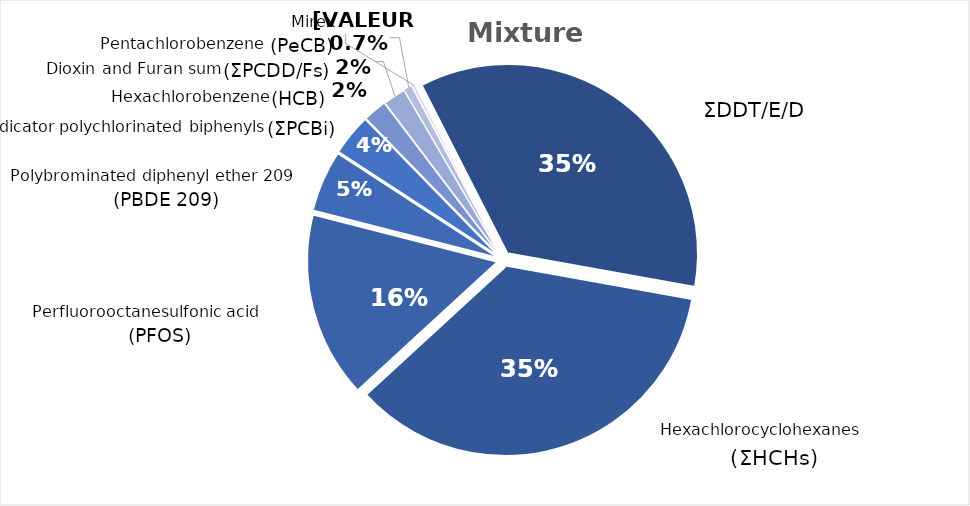
| Category | Series 0 |
|---|---|
| ΣDDT/E/D | 0.353 |
| Hexachlorocyclohexanes (ΣHCHs) | 0.353 |
| Perfluorooctanesulfonic acid  (PFOS) | 0.158 |
| Polybrominated diphenyl ether 209 (PBDE 209) | 0.052 |
| Indicator polychlorinated biphenyls (ΣPCBi) | 0.035 |
| Hexachlorobenzene (HCB) | 0.02 |
| Dioxin and furan sum (ΣPCDD/Fs) | 0.019 |
| Pentachlorobenzene (PeCB) | 0.007 |
| Mirex | 0.002 |